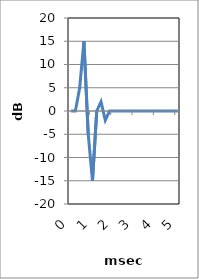
| Category | Series 0 |
|---|---|
| 0.0 | 0 |
| 0.2 | 0 |
| 0.4 | 5 |
| 0.6 | 15 |
| 0.8 | -5 |
| 1.0 | -15 |
| 1.2 | 0 |
| 1.4 | 2 |
| 1.6 | -2 |
| 1.8 | 0 |
| 2.0 | 0 |
| 2.2 | 0 |
| 2.4 | 0 |
| 2.6 | 0 |
| 2.8 | 0 |
| 3.0 | 0 |
| 3.2 | 0 |
| 3.4 | 0 |
| 3.6 | 0 |
| 3.8 | 0 |
| 4.0 | 0 |
| 4.2 | 0 |
| 4.4 | 0 |
| 4.6 | 0 |
| 4.8 | 0 |
| 5.0 | 0 |